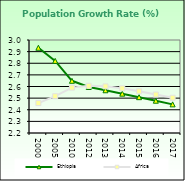
| Category | Ethiopia | Africa  |
|---|---|---|
| 2000.0 | 2.933 | 2.458 |
| 2005.0 | 2.82 | 2.516 |
| 2010.0 | 2.649 | 2.59 |
| 2012.0 | 2.596 | 2.606 |
| 2013.0 | 2.568 | 2.601 |
| 2014.0 | 2.538 | 2.584 |
| 2015.0 | 2.508 | 2.559 |
| 2016.0 | 2.478 | 2.531 |
| 2017.0 | 2.446 | 2.503 |